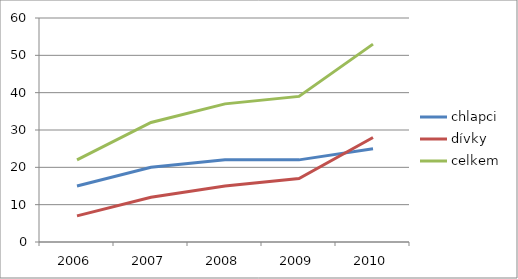
| Category | chlapci | dívky | celkem |
|---|---|---|---|
| 2006.0 | 15 | 7 | 22 |
| 2007.0 | 20 | 12 | 32 |
| 2008.0 | 22 | 15 | 37 |
| 2009.0 | 22 | 17 | 39 |
| 2010.0 | 25 | 28 | 53 |